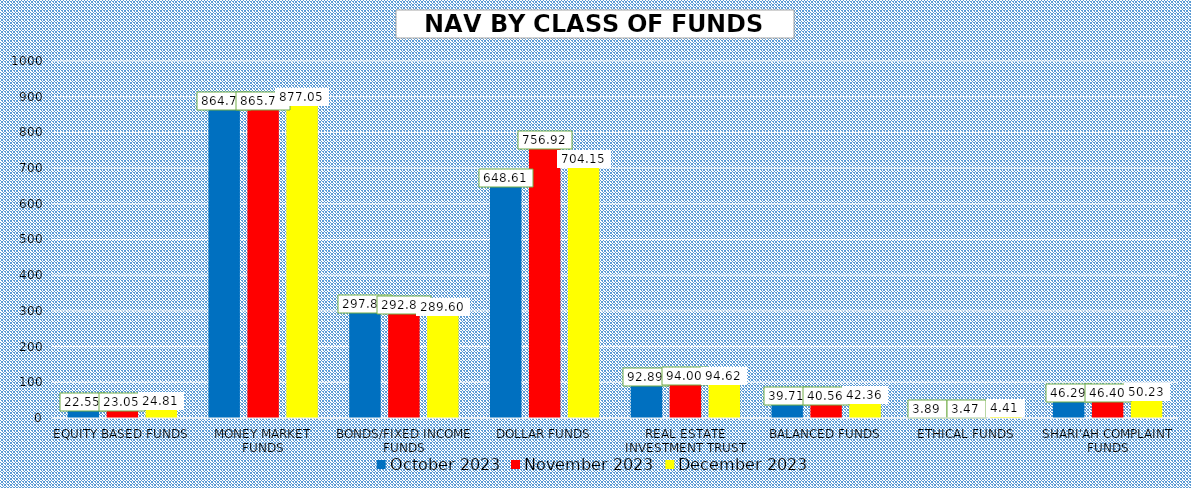
| Category | October 2023 | November 2023 | December 2023 |
|---|---|---|---|
| EQUITY BASED FUNDS | 22.548 | 23.047 | 24.813 |
| MONEY MARKET FUNDS | 864.77 | 865.757 | 877.055 |
| BONDS/FIXED INCOME FUNDS | 297.869 | 292.87 | 289.598 |
| DOLLAR FUNDS | 648.613 | 756.918 | 704.148 |
| REAL ESTATE INVESTMENT TRUST | 92.891 | 93.996 | 94.622 |
| BALANCED FUNDS | 39.715 | 40.559 | 42.357 |
| ETHICAL FUNDS | 3.894 | 3.472 | 4.407 |
| SHARI'AH COMPLAINT FUNDS | 46.293 | 46.398 | 50.225 |